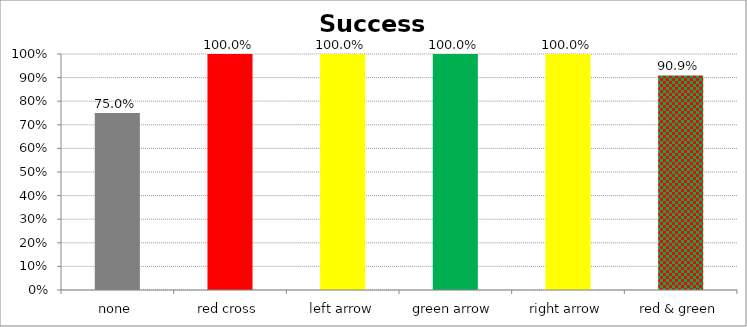
| Category | Success Rate |
|---|---|
| none | 0.75 |
| red cross | 1 |
| left arrow | 1 |
| green arrow | 1 |
| right arrow | 1 |
| red & green | 0.909 |